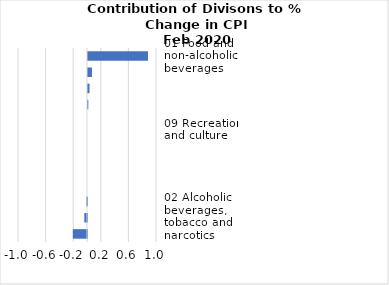
| Category |     Contributions |
|---|---|
| 01 Food and non-alcoholic beverages | 0.869 |
| 07 Transport | 0.057 |
| 05 Furnishings, household equipment and routine household maintenance | 0.022 |
| 03 Clothing and footwear | 0.004 |
| 11 Restaurants and hotels | 0 |
| 09 Recreation and culture | 0 |
| 10 Education | 0 |
| 06 Health | 0 |
| 08 Communication | 0 |
| 12 Miscellaneous goods and services | -0.011 |
| 02 Alcoholic beverages, tobacco and narcotics | -0.039 |
| 04 Housing, water, electricity, gas and other fuels | -0.205 |